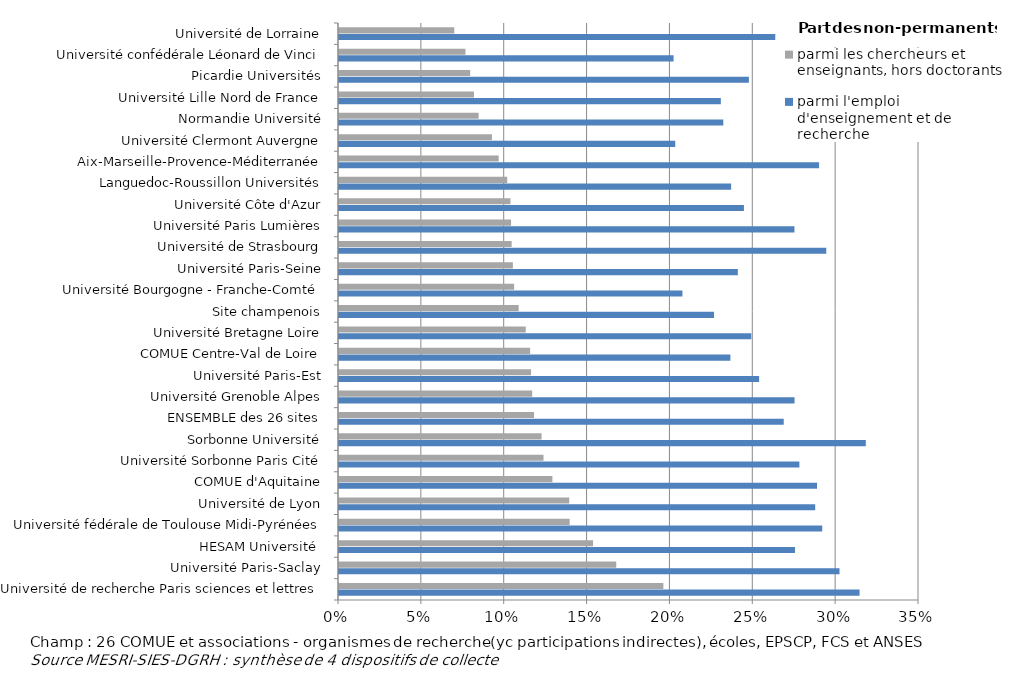
| Category | parmi l'emploi d'enseignement et de recherche | parmi les chercheurs et enseignants, hors doctorants |
|---|---|---|
| Université de recherche Paris sciences et lettres | 0.314 | 0.196 |
| Université Paris-Saclay | 0.302 | 0.167 |
| HESAM Université  | 0.275 | 0.153 |
| Université fédérale de Toulouse Midi-Pyrénées | 0.292 | 0.139 |
| Université de Lyon | 0.287 | 0.139 |
| COMUE d'Aquitaine | 0.288 | 0.129 |
| Université Sorbonne Paris Cité | 0.278 | 0.123 |
| Sorbonne Université | 0.318 | 0.122 |
| ENSEMBLE des 26 sites | 0.268 | 0.118 |
| Université Grenoble Alpes | 0.275 | 0.117 |
| Université Paris-Est | 0.254 | 0.116 |
| COMUE Centre-Val de Loire | 0.236 | 0.115 |
| Université Bretagne Loire | 0.249 | 0.113 |
| Site champenois | 0.226 | 0.108 |
| Université Bourgogne - Franche-Comté | 0.207 | 0.106 |
| Université Paris-Seine | 0.241 | 0.105 |
| Université de Strasbourg | 0.294 | 0.104 |
| Université Paris Lumières | 0.275 | 0.104 |
| Université Côte d'Azur | 0.244 | 0.103 |
| Languedoc-Roussillon Universités | 0.237 | 0.102 |
| Aix-Marseille-Provence-Méditerranée | 0.29 | 0.096 |
| Université Clermont Auvergne | 0.203 | 0.092 |
| Normandie Université | 0.232 | 0.084 |
| Université Lille Nord de France | 0.23 | 0.081 |
| Picardie Universités | 0.247 | 0.079 |
| Université confédérale Léonard de Vinci | 0.202 | 0.076 |
| Université de Lorraine | 0.263 | 0.07 |